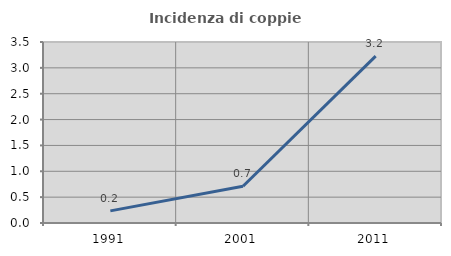
| Category | Incidenza di coppie miste |
|---|---|
| 1991.0 | 0.235 |
| 2001.0 | 0.71 |
| 2011.0 | 3.226 |